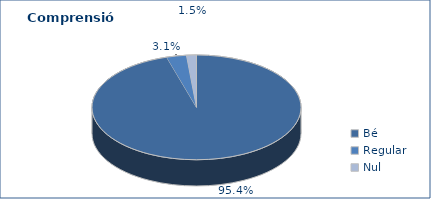
| Category | Series 0 |
|---|---|
| Bé | 5482 |
| Regular | 177 |
| Nul | 88 |